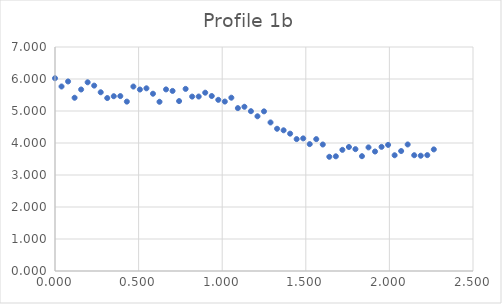
| Category | Series 0 |
|---|---|
| 0.0 | 6.024 |
| 0.0390625 | 5.766 |
| 0.078125 | 5.923 |
| 0.1171875 | 5.414 |
| 0.15625 | 5.672 |
| 0.1953125 | 5.897 |
| 0.234375 | 5.793 |
| 0.2734375 | 5.585 |
| 0.3125 | 5.405 |
| 0.3515625 | 5.462 |
| 0.390625 | 5.466 |
| 0.4296875 | 5.293 |
| 0.46875 | 5.764 |
| 0.5078125 | 5.671 |
| 0.546875 | 5.709 |
| 0.5859375 | 5.54 |
| 0.625 | 5.288 |
| 0.6640625 | 5.675 |
| 0.703125 | 5.627 |
| 0.7421875 | 5.31 |
| 0.78125 | 5.691 |
| 0.8203125 | 5.45 |
| 0.859375 | 5.452 |
| 0.8984375 | 5.572 |
| 0.9375 | 5.468 |
| 0.9765625 | 5.349 |
| 1.015625 | 5.295 |
| 1.0546875 | 5.416 |
| 1.09375 | 5.09 |
| 1.1328125 | 5.132 |
| 1.171875 | 4.994 |
| 1.2109375 | 4.835 |
| 1.25 | 4.989 |
| 1.2890625 | 4.642 |
| 1.328125 | 4.445 |
| 1.3671875 | 4.397 |
| 1.40625 | 4.292 |
| 1.4453125 | 4.122 |
| 1.484375 | 4.144 |
| 1.5234375 | 3.965 |
| 1.5625 | 4.121 |
| 1.6015625 | 3.953 |
| 1.640625 | 3.569 |
| 1.6796875 | 3.584 |
| 1.71875 | 3.786 |
| 1.7578125 | 3.875 |
| 1.796875 | 3.808 |
| 1.8359375 | 3.588 |
| 1.875 | 3.863 |
| 1.9140625 | 3.734 |
| 1.953125 | 3.879 |
| 1.9921875 | 3.941 |
| 2.03125 | 3.617 |
| 2.0703125 | 3.749 |
| 2.109375 | 3.954 |
| 2.1484375 | 3.618 |
| 2.1875 | 3.603 |
| 2.2265625 | 3.621 |
| 2.265625 | 3.8 |